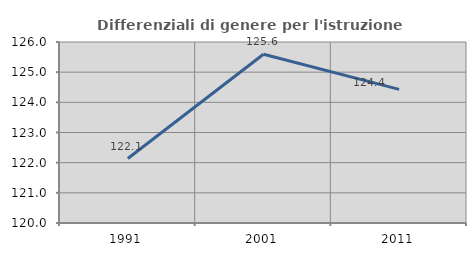
| Category | Differenziali di genere per l'istruzione superiore |
|---|---|
| 1991.0 | 122.136 |
| 2001.0 | 125.592 |
| 2011.0 | 124.431 |